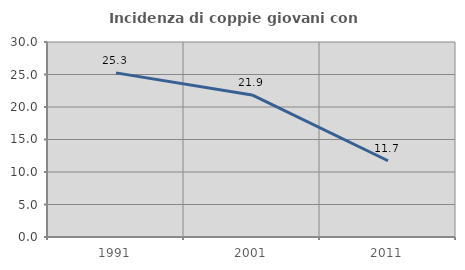
| Category | Incidenza di coppie giovani con figli |
|---|---|
| 1991.0 | 25.251 |
| 2001.0 | 21.851 |
| 2011.0 | 11.733 |